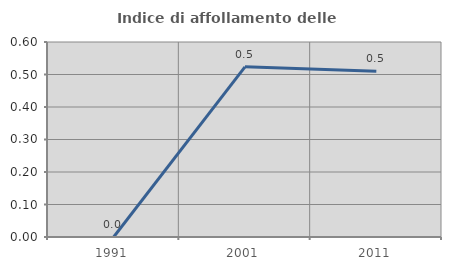
| Category | Indice di affollamento delle abitazioni  |
|---|---|
| 1991.0 | 0 |
| 2001.0 | 0.524 |
| 2011.0 | 0.51 |